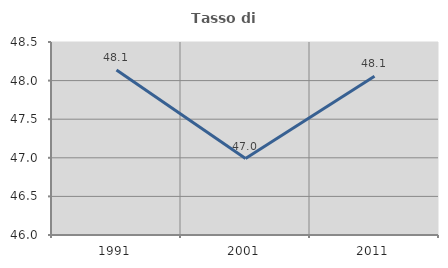
| Category | Tasso di occupazione   |
|---|---|
| 1991.0 | 48.136 |
| 2001.0 | 46.991 |
| 2011.0 | 48.056 |